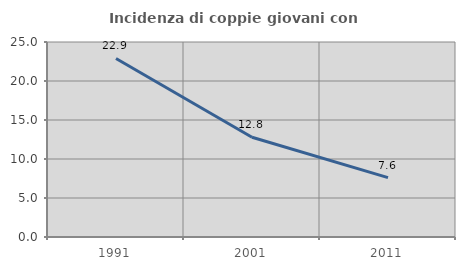
| Category | Incidenza di coppie giovani con figli |
|---|---|
| 1991.0 | 22.893 |
| 2001.0 | 12.788 |
| 2011.0 | 7.606 |